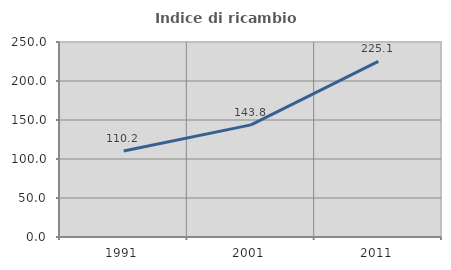
| Category | Indice di ricambio occupazionale  |
|---|---|
| 1991.0 | 110.175 |
| 2001.0 | 143.75 |
| 2011.0 | 225.058 |